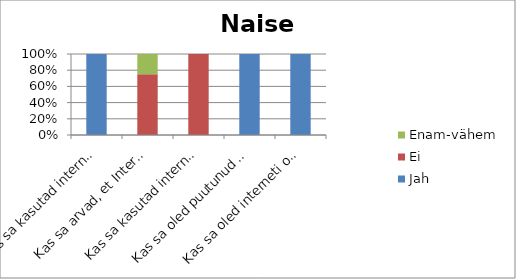
| Category | Jah | Ei | Enam-vähem |
|---|---|---|---|
| Kas sa kasutad internetti igapäevaselt? | 4 | 0 | 0 |
| Kas sa arvad, et Internet on turvaline? | 0 | 3 | 1 |
| Kas sa kasutad internetis suheldes veebikaamerat | 0 | 4 | 0 |
| Kas sa oled puutunud kokku probleemidega internetis? | 4 | 0 | 0 |
| Kas sa oled interneti ohtudest teadlik? | 4 | 0 | 0 |